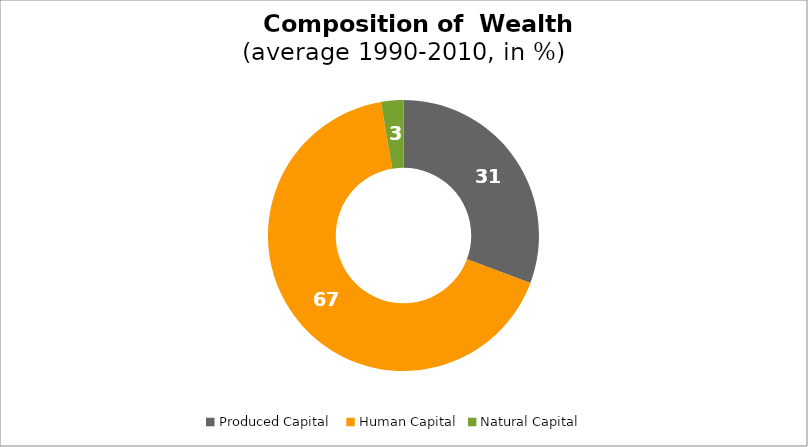
| Category | Series 0 |
|---|---|
| Produced Capital  | 30.702 |
| Human Capital | 66.639 |
| Natural Capital | 2.658 |